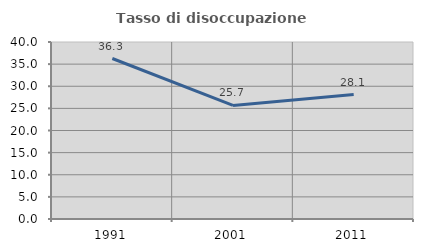
| Category | Tasso di disoccupazione giovanile  |
|---|---|
| 1991.0 | 36.266 |
| 2001.0 | 25.669 |
| 2011.0 | 28.133 |